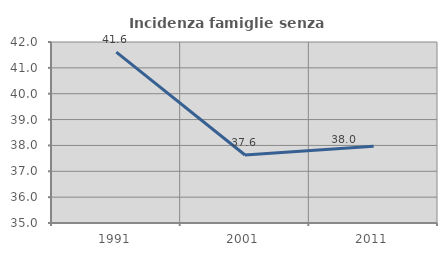
| Category | Incidenza famiglie senza nuclei |
|---|---|
| 1991.0 | 41.611 |
| 2001.0 | 37.631 |
| 2011.0 | 37.97 |